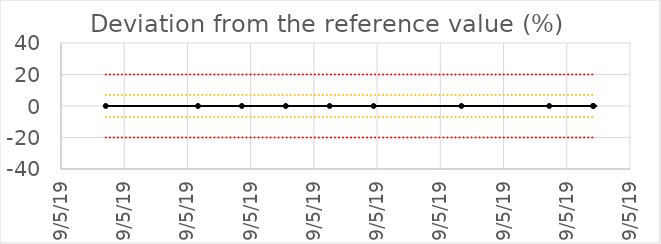
| Category | Abweichung Sollwert |
|---|---|
| 43594.37708333333 | 0.015 |
| 43594.39166666667 | 0.015 |
| 43594.39861111111 | 0.014 |
| 43594.40555555555 | 0.014 |
| 43594.4125 | 0.013 |
| 43594.419444444444 | 0.012 |
| 43594.433333333334 | 0.012 |
| 43594.447222222225 | 0.011 |
| 43594.45416666667 | 0.011 |
| 43594.45416666667 | 0.011 |
| nan | 0 |
| nan | 0 |
| nan | 0 |
| nan | 0 |
| nan | 0 |
| nan | 0 |
| nan | 0 |
| nan | 0 |
| nan | 0 |
| nan | 0 |
| nan | 0 |
| nan | 0 |
| nan | 0 |
| nan | 0 |
| nan | 0 |
| nan | 0 |
| nan | 0 |
| nan | 0 |
| nan | 0 |
| nan | 0 |
| nan | 0 |
| nan | 0 |
| nan | 0 |
| nan | 0 |
| nan | 0 |
| nan | 0 |
| nan | 0 |
| nan | 0 |
| nan | 0 |
| nan | 0 |
| nan | 0 |
| nan | 0 |
| nan | 0 |
| nan | 0 |
| nan | 0 |
| nan | 0 |
| nan | 0 |
| nan | 0 |
| nan | 0 |
| nan | 0 |
| nan | 0 |
| nan | 0 |
| nan | 0 |
| nan | 0 |
| nan | 0 |
| nan | 0 |
| nan | 0 |
| nan | 0 |
| nan | 0 |
| nan | 0 |
| nan | 0 |
| nan | 0 |
| nan | 0 |
| nan | 0 |
| nan | 0 |
| nan | 0 |
| nan | 0 |
| nan | 0 |
| nan | 0 |
| nan | 0 |
| nan | 0 |
| nan | 0 |
| nan | 0 |
| nan | 0 |
| nan | 0 |
| nan | 0 |
| nan | 0 |
| nan | 0 |
| nan | 0 |
| nan | 0 |
| nan | 0 |
| nan | 0 |
| nan | 0 |
| nan | 0 |
| nan | 0 |
| nan | 0 |
| nan | 0 |
| nan | 0 |
| nan | 0 |
| nan | 0 |
| nan | 0 |
| nan | 0 |
| nan | 0 |
| nan | 0 |
| nan | 0 |
| nan | 0 |
| nan | 0 |
| nan | 0 |
| nan | 0 |
| nan | 0 |